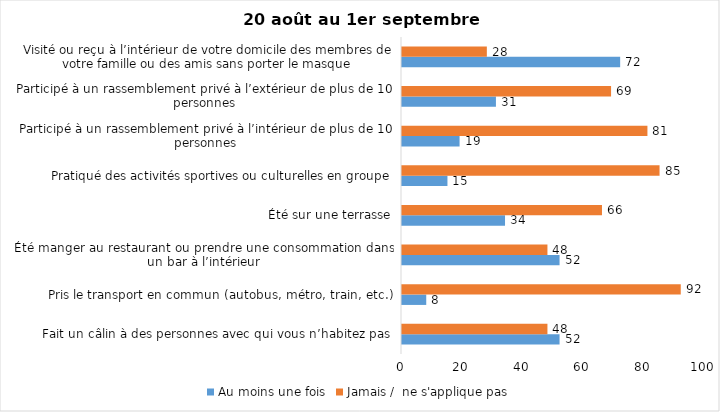
| Category | Au moins une fois | Jamais /  ne s'applique pas |
|---|---|---|
| Fait un câlin à des personnes avec qui vous n’habitez pas | 52 | 48 |
| Pris le transport en commun (autobus, métro, train, etc.) | 8 | 92 |
| Été manger au restaurant ou prendre une consommation dans un bar à l’intérieur | 52 | 48 |
| Été sur une terrasse | 34 | 66 |
| Pratiqué des activités sportives ou culturelles en groupe | 15 | 85 |
| Participé à un rassemblement privé à l’intérieur de plus de 10 personnes | 19 | 81 |
| Participé à un rassemblement privé à l’extérieur de plus de 10 personnes | 31 | 69 |
| Visité ou reçu à l’intérieur de votre domicile des membres de votre famille ou des amis sans porter le masque | 72 | 28 |